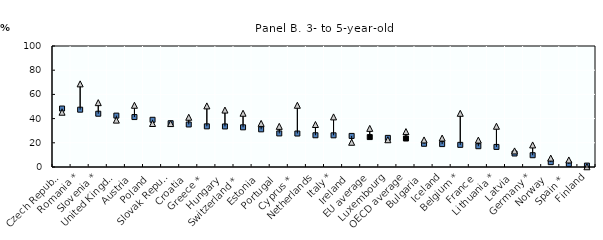
| Category | Not attained tertiary education | Attained tertiary education |
|---|---|---|
| Czech Republic | 48.317 | 45.262 |
| Romania * | 47.366 | 68.708 |
| Slovenia * | 44.029 | 53.189 |
| United Kingdom | 42.461 | 38.746 |
| Austria | 41.276 | 51.018 |
| Poland | 39.014 | 35.951 |
| Slovak Republic | 36.187 | 35.886 |
| Croatia | 35.138 | 41.109 |
| Greece * | 33.596 | 50.493 |
| Hungary | 33.502 | 47.05 |
| Switzerland * | 32.792 | 44.432 |
| Estonia | 31.128 | 36.03 |
| Portugal | 27.747 | 33.594 |
| Cyprus * | 27.656 | 51.024 |
| Netherlands | 26.239 | 35.114 |
| Italy * | 26.18 | 41.409 |
| Ireland | 25.686 | 20.441 |
| EU average | 24.729 | 31.91 |
| Luxembourg | 24.059 | 22.528 |
| OECD average | 23.531 | 29.265 |
| Bulgaria | 19.189 | 22.374 |
| Iceland | 18.924 | 23.917 |
| Belgium * | 18.301 | 44.377 |
| France | 17.184 | 22.234 |
| Lithuania * | 16.592 | 33.686 |
| Latvia | 11.156 | 13.3 |
| Germany * | 9.729 | 18.221 |
| Norway | 4.015 | 7.352 |
| Spain * | 2.528 | 5.814 |
| Finland | 1.161 | 0.201 |